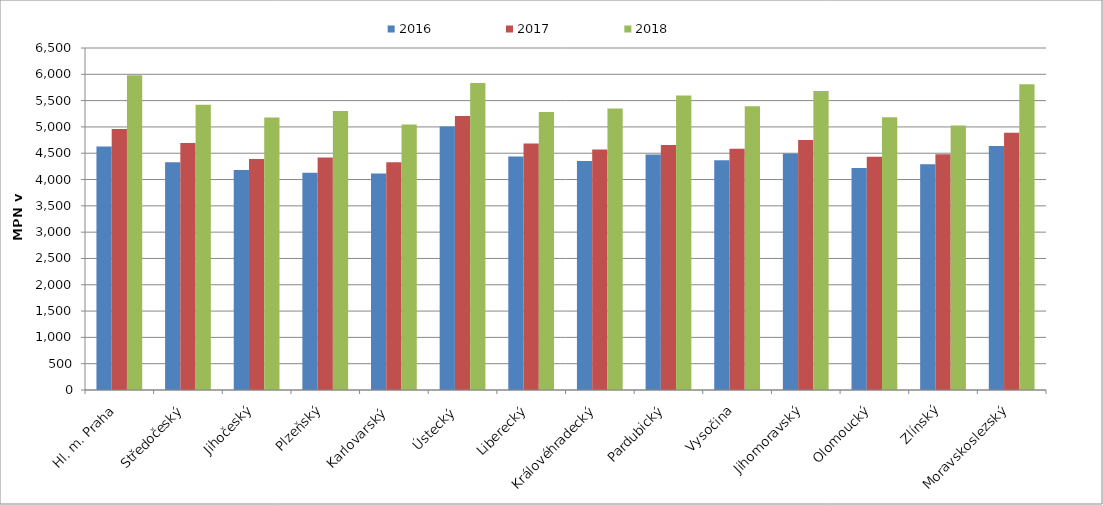
| Category | 2016 | 2017 | 2018 |
|---|---|---|---|
| Hl. m. Praha | 4625.912 | 4961.604 | 5979.748 |
| Středočeský | 4326.702 | 4692.147 | 5420.277 |
| Jihočeský | 4182.825 | 4391.394 | 5177.464 |
| Plzeňský | 4130.136 | 4419.185 | 5302.958 |
| Karlovarský  | 4115.742 | 4330.476 | 5046.257 |
| Ústecký   | 5008 | 5208.195 | 5834.941 |
| Liberecký | 4439.596 | 4684.951 | 5281.76 |
| Královéhradecký | 4354.54 | 4572.107 | 5349.436 |
| Pardubický | 4477.211 | 4656.515 | 5596.335 |
| Vysočina | 4368.398 | 4586.781 | 5394.282 |
| Jihomoravský | 4493.154 | 4749.795 | 5684.026 |
| Olomoucký | 4219.941 | 4431.098 | 5184.214 |
| Zlínský | 4289.756 | 4480.271 | 5028.711 |
| Moravskoslezský | 4636.569 | 4889.336 | 5809.859 |